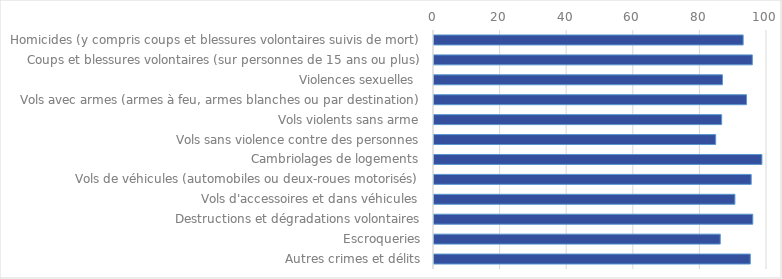
| Category | Series 0 |
|---|---|
| Homicides (y compris coups et blessures volontaires suivis de mort) | 92.839 |
| Coups et blessures volontaires (sur personnes de 15 ans ou plus) | 95.585 |
| Violences sexuelles  | 86.619 |
| Vols avec armes (armes à feu, armes blanches ou par destination) | 93.86 |
| Vols violents sans arme | 86.386 |
| Vols sans violence contre des personnes | 84.594 |
| Cambriolages de logements | 98.474 |
| Vols de véhicules (automobiles ou deux-roues motorisés) | 95.256 |
| Vols d'accessoires et dans véhicules | 90.36 |
| Destructions et dégradations volontaires | 95.734 |
| Escroqueries | 85.962 |
| Autres crimes et délits | 94.98 |